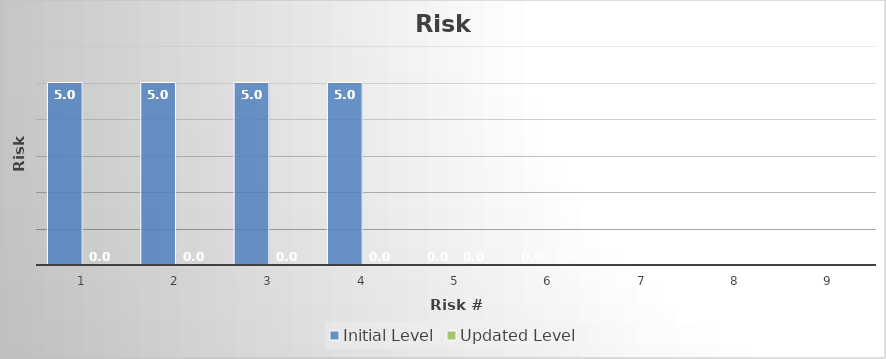
| Category | Initial Level | Updated Level |
|---|---|---|
| 0 | 5 | 0 |
| 1 | 5 | 0 |
| 2 | 5 | 0 |
| 3 | 5 | 0 |
| 4 | 0 | 0 |
| 5 | 0 | 0 |
| 6 | 0 | 0 |
| 7 | 0 | 0 |
| 8 | 0 | 0 |